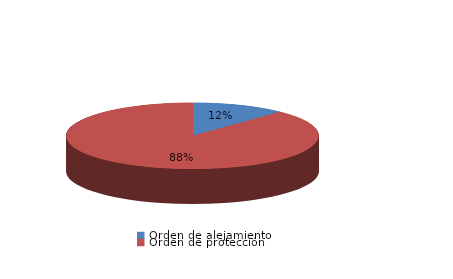
| Category | Series 0 |
|---|---|
| Orden de alejamiento | 3 |
| Orden de protección | 22 |